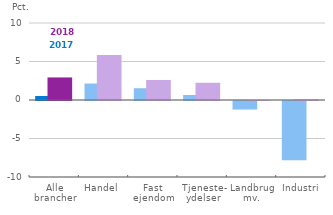
| Category | 2017 | 2018 |
|---|---|---|
| Alle
brancher | 0.52 | 2.93 |
| Handel  | 2.14 | 5.84 |
| Fast
ejendom | 1.53 | 2.6 |
| Tjeneste-
ydelser | 0.65 | 2.24 |
| Landbrug
mv. | -1.11 | 0.03 |
| Industri | -7.71 | 0.09 |